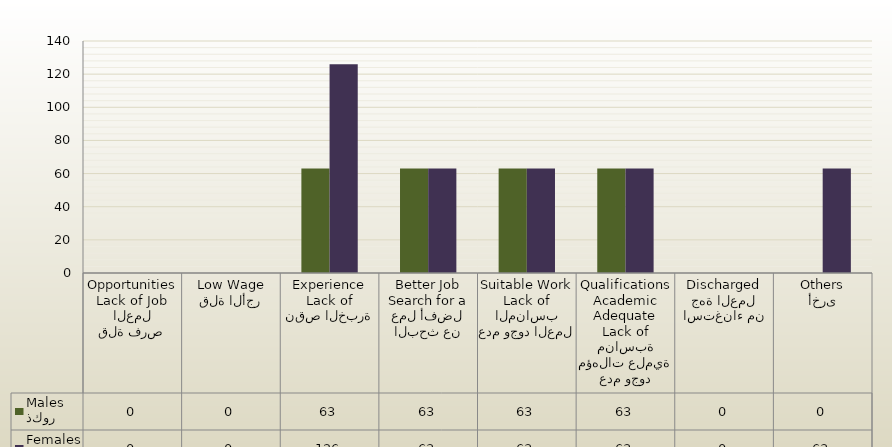
| Category | ذكور
Males | اناث
Females |
|---|---|---|
| قلة فرص العمل
Lack of Job Opportunities | 0 | 0 |
| قلة الأجر
Low Wage | 0 | 0 |
| نقص الخبرة
Lack of Experience | 63 | 126 |
| البحث عن عمل أفضل
Search for a Better Job | 63 | 63 |
| عدم وجود العمل المناسب
Lack of Suitable Work | 63 | 63 |
| عدم وجود مؤهلات علمية مناسبة
Lack of Adequate Academic Qualifications | 63 | 63 |
| استغناء من جهة العمل
Discharged | 0 | 0 |
| أخرى
Others | 0 | 63 |